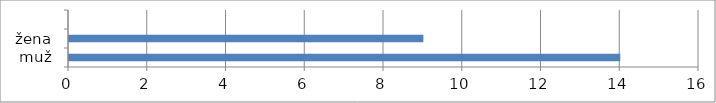
| Category | Series 0 |
|---|---|
|  muž | 14 |
|  žena | 9 |